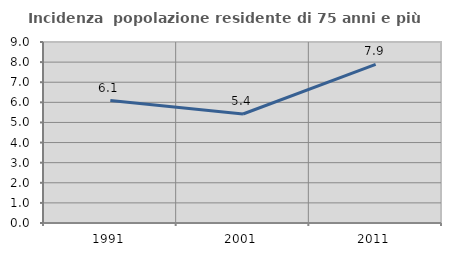
| Category | Incidenza  popolazione residente di 75 anni e più |
|---|---|
| 1991.0 | 6.088 |
| 2001.0 | 5.419 |
| 2011.0 | 7.884 |